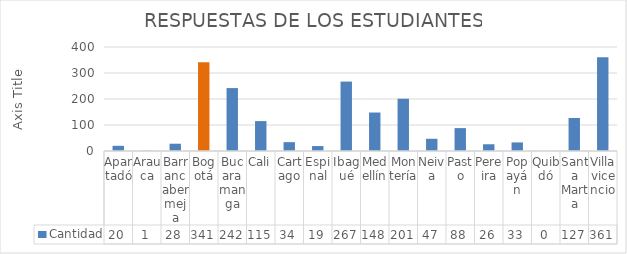
| Category | Cantidad |
|---|---|
| Apartadó | 20 |
| Arauca | 1 |
| Barrancabermeja | 28 |
| Bogotá | 341 |
| Bucaramanga | 242 |
| Cali | 115 |
| Cartago | 34 |
| Espinal | 19 |
| Ibagué | 267 |
| Medellín | 148 |
| Montería | 201 |
| Neiva | 47 |
| Pasto | 88 |
| Pereira | 26 |
| Popayán | 33 |
| Quibdó | 0 |
| Santa Marta | 127 |
| Villavicencio | 361 |